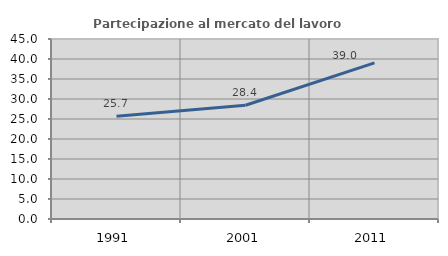
| Category | Partecipazione al mercato del lavoro  femminile |
|---|---|
| 1991.0 | 25.686 |
| 2001.0 | 28.426 |
| 2011.0 | 39.027 |